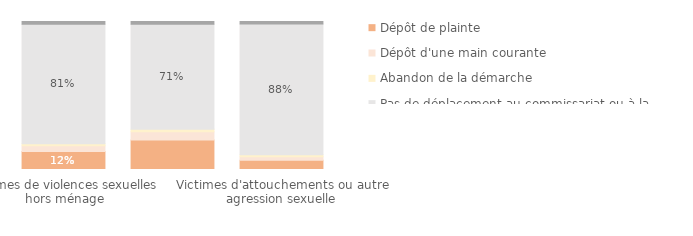
| Category | Dépôt de plainte | Dépôt d'une main courante | Abandon de la démarche | Pas de déplacement au commissariat ou à la gendarmerie | Ne sait pas/Refus |
|---|---|---|---|---|---|
| Victimes de violences sexuelles hors ménage | 0.122 | 0.038 | 0.015 | 0.807 | 0.018 |
| Victimes d'un viol ou d'une tentative de viol  | 0.199 | 0.056 | 0.017 | 0.709 | 0.019 |
| Victimes d'attouchements ou autre agression sexuelle | 0.063 | 0.024 | 0.013 | 0.883 | 0.018 |